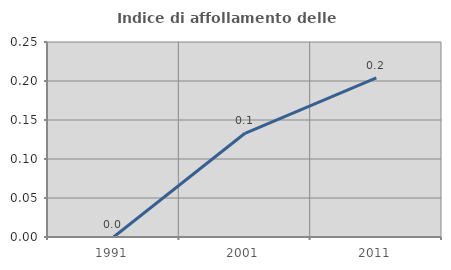
| Category | Indice di affollamento delle abitazioni  |
|---|---|
| 1991.0 | 0 |
| 2001.0 | 0.133 |
| 2011.0 | 0.204 |